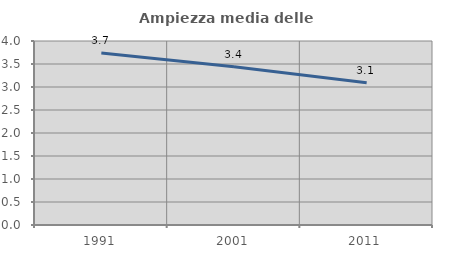
| Category | Ampiezza media delle famiglie |
|---|---|
| 1991.0 | 3.738 |
| 2001.0 | 3.438 |
| 2011.0 | 3.093 |